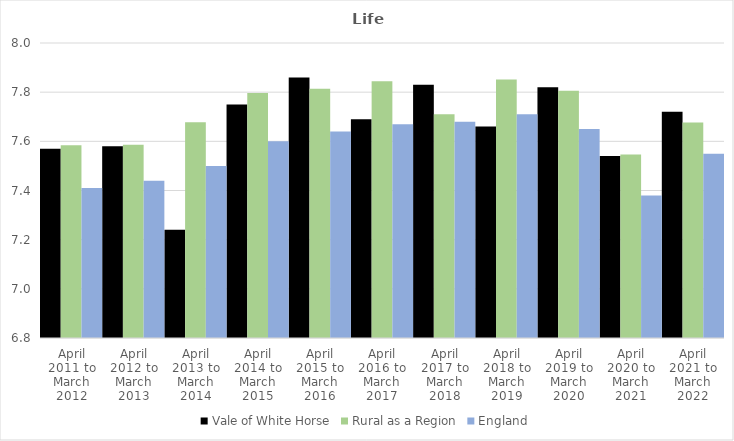
| Category | Vale of White Horse | Rural as a Region | England |
|---|---|---|---|
| April 2011 to March 2012 | 7.57 | 7.584 | 7.41 |
| April 2012 to March 2013 | 7.58 | 7.586 | 7.44 |
| April 2013 to March 2014 | 7.24 | 7.677 | 7.5 |
| April 2014 to March 2015 | 7.75 | 7.797 | 7.6 |
| April 2015 to March 2016 | 7.86 | 7.813 | 7.64 |
| April 2016 to March 2017 | 7.69 | 7.845 | 7.67 |
| April 2017 to March 2018 | 7.83 | 7.71 | 7.68 |
| April 2018 to March 2019 | 7.66 | 7.852 | 7.71 |
| April 2019 to March 2020 | 7.82 | 7.806 | 7.65 |
| April 2020 to March 2021 | 7.54 | 7.546 | 7.38 |
| April 2021 to March 2022 | 7.72 | 7.677 | 7.55 |